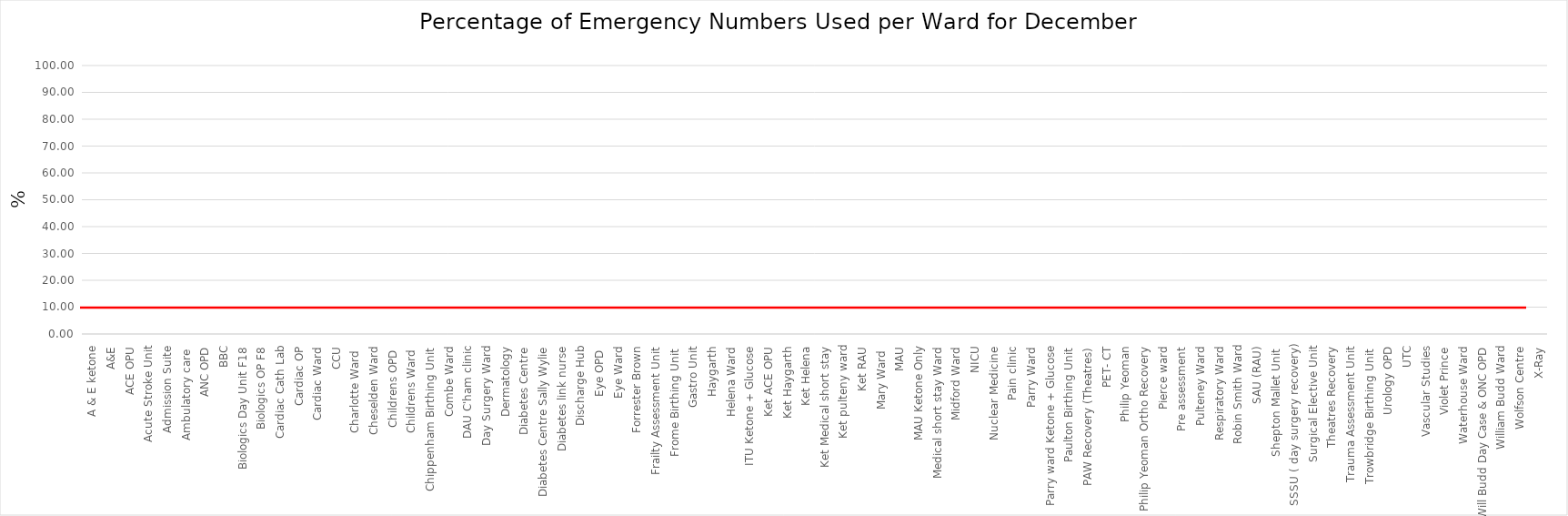
| Category | Series 0 |
|---|---|
| A & E ketone | 0 |
| A&E | 0 |
| ACE OPU | 0 |
| Acute Stroke Unit | 0 |
| Admission Suite | 0 |
| Ambulatory care  | 0 |
| ANC OPD | 0 |
| BBC | 0 |
| Biologics Day Unit F18 | 0 |
| Biologics OP F8 | 0 |
| Cardiac Cath Lab | 0 |
| Cardiac OP | 0 |
| Cardiac Ward | 0 |
| CCU | 0 |
| Charlotte Ward  | 0 |
| Cheselden Ward | 0 |
| Childrens OPD  | 0 |
| Childrens Ward  | 0 |
| Chippenham Birthing Unit  | 0 |
| Combe Ward | 0 |
| DAU C'ham clinic | 0 |
| Day Surgery Ward | 0 |
| Dermatology | 0 |
| Diabetes Centre | 0 |
| Diabetes Centre Sally Wylie | 0 |
| Diabetes link nurse | 0 |
| Discharge Hub | 0 |
| Eye OPD  | 0 |
| Eye Ward | 0 |
| Forrester Brown | 0 |
| Frailty Assessment Unit | 0 |
| Frome Birthing Unit  | 0 |
| Gastro Unit | 0 |
| Haygarth | 0 |
| Helena Ward | 0 |
| ITU Ketone + Glucose | 0 |
| Ket ACE OPU | 0 |
| Ket Haygarth | 0 |
| Ket Helena | 0 |
| Ket Medical short stay | 0 |
| Ket pulteny ward | 0 |
| Ket RAU | 0 |
| Mary Ward  | 0 |
| MAU | 0 |
| MAU Ketone Only | 0 |
| Medical short stay Ward | 0 |
| Midford Ward | 0 |
| NICU | 0 |
| Nuclear Medicine | 0 |
| Pain clinic | 0 |
| Parry Ward | 0 |
| Parry ward Ketone + Glucose | 0 |
| Paulton Birthing Unit  | 0 |
| PAW Recovery (Theatres) | 0 |
| PET- CT | 0 |
| Philip Yeoman | 0 |
| Philip Yeoman Ortho Recovery | 0 |
| Pierce ward | 0 |
| Pre assessment | 0 |
| Pulteney Ward | 0 |
| Respiratory Ward | 0 |
| Robin Smith Ward | 0 |
| SAU (RAU) | 0 |
| Shepton Mallet Unit  | 0 |
| SSSU ( day surgery recovery) | 0 |
| Surgical Elective Unit | 0 |
| Theatres Recovery | 0 |
| Trauma Assessment Unit | 0 |
| Trowbridge Birthing Unit  | 0 |
| Urology OPD | 0 |
| UTC | 0 |
| Vascular Studies | 0 |
| Violet Prince | 0 |
| Waterhouse Ward | 0 |
| Will Budd Day Case & ONC OPD | 0 |
| William Budd Ward | 0 |
| Wolfson Centre | 0 |
| X-Ray | 0 |